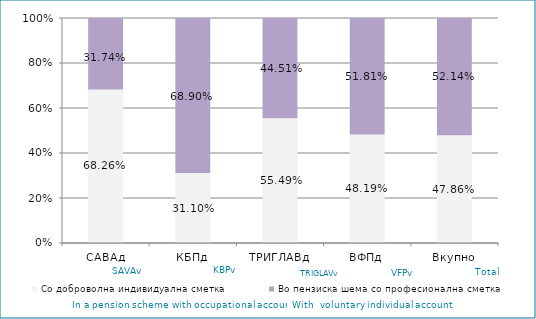
| Category | Со доброволна индивидуална сметка  | Во пензиска шема со професионална сметка |
|---|---|---|
| САВАд | 0.683 | 0.317 |
| КБПд | 0.311 | 0.689 |
| ТРИГЛАВд | 0.555 | 0.445 |
| ВФПд | 0.482 | 0.518 |
| Вкупно | 0.479 | 0.521 |